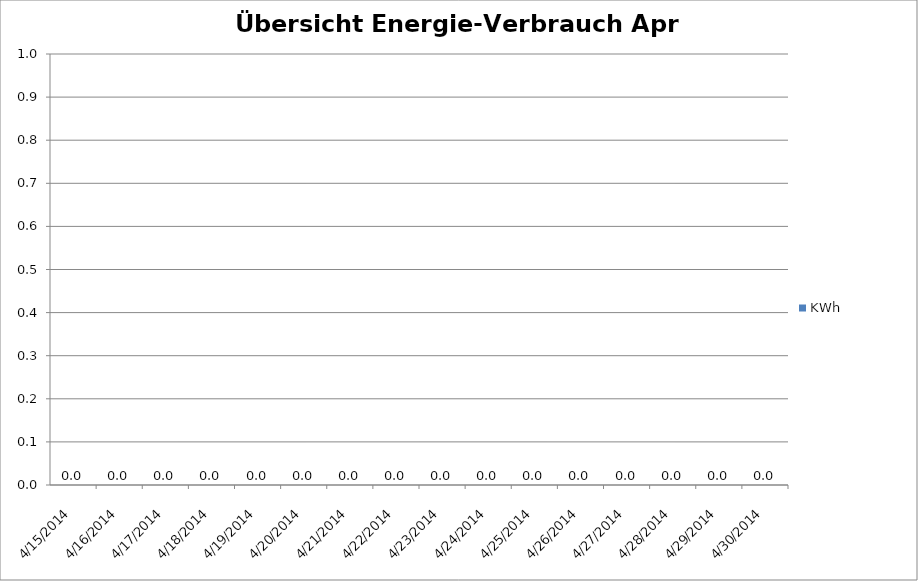
| Category | KWh |
|---|---|
| 4/15/14 | 0 |
| 4/16/14 | 0 |
| 4/17/14 | 0 |
| 4/18/14 | 0 |
| 4/19/14 | 0 |
| 4/20/14 | 0 |
| 4/21/14 | 0 |
| 4/22/14 | 0 |
| 4/23/14 | 0 |
| 4/24/14 | 0 |
| 4/25/14 | 0 |
| 4/26/14 | 0 |
| 4/27/14 | 0 |
| 4/28/14 | 0 |
| 4/29/14 | 0 |
| 4/30/14 | 0 |
| nan | 0 |